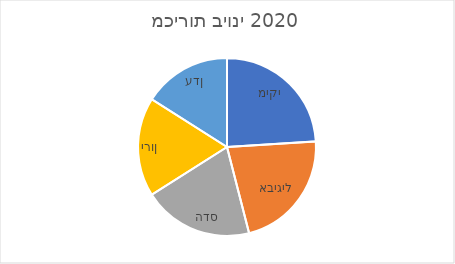
| Category | מכירות ביוני 2020 |
|---|---|
| מיקי | 600 |
| אביגיל | 550 |
| הדס | 500 |
| ירון | 450 |
| עדן | 400 |